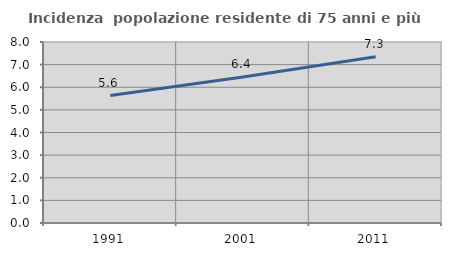
| Category | Incidenza  popolazione residente di 75 anni e più |
|---|---|
| 1991.0 | 5.633 |
| 2001.0 | 6.448 |
| 2011.0 | 7.349 |